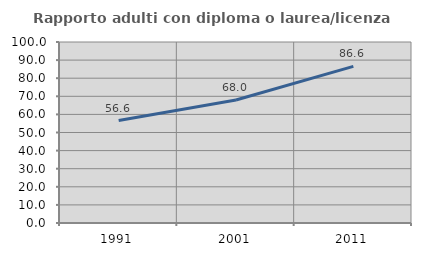
| Category | Rapporto adulti con diploma o laurea/licenza media  |
|---|---|
| 1991.0 | 56.615 |
| 2001.0 | 67.979 |
| 2011.0 | 86.554 |